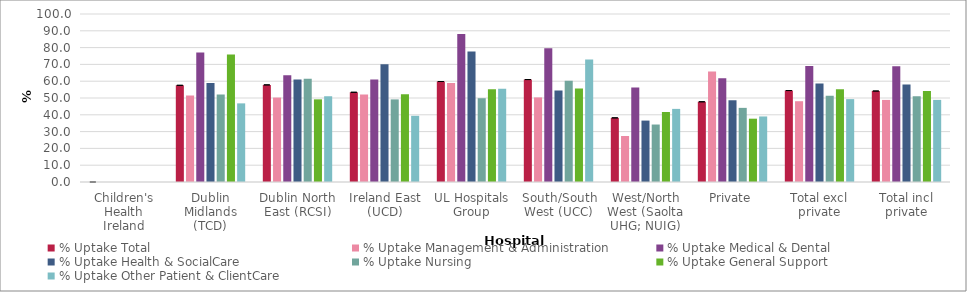
| Category | % Uptake Total  | % Uptake Management & Administration | % Uptake Medical & Dental | % Uptake Health & SocialCare | % Uptake Nursing | % Uptake General Support | % Uptake Other Patient & ClientCare |
|---|---|---|---|---|---|---|---|
| Children's Health Ireland | 0 | 0 | 0 | 0 | 0 | 0 | 0 |
| Dublin Midlands (TCD) | 57.552 | 51.511 | 77.043 | 58.895 | 52.139 | 75.853 | 46.805 |
| Dublin North East (RCSI) | 57.812 | 50.258 | 63.606 | 61.035 | 61.476 | 49.196 | 51.081 |
| Ireland East (UCD) | 53.406 | 52.064 | 60.98 | 70.072 | 49.173 | 52.291 | 39.409 |
| UL Hospitals Group | 59.816 | 59 | 88.056 | 77.649 | 49.87 | 55.222 | 55.484 |
| South/South West (UCC) | 60.979 | 50.352 | 79.594 | 54.463 | 60.224 | 55.673 | 72.867 |
| West/North West (Saolta UHG; NUIG) | 38.183 | 27.377 | 56.285 | 36.557 | 34.212 | 41.65 | 43.519 |
| Private | 47.758 | 65.828 | 61.818 | 48.654 | 44.129 | 37.684 | 39.016 |
| Total excl private | 54.442 | 48.089 | 68.99 | 58.568 | 51.337 | 55.215 | 49.327 |
| Total incl private | 54.151 | 48.853 | 68.836 | 58.034 | 51.022 | 54.186 | 48.873 |